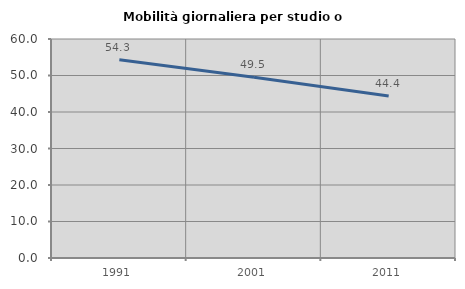
| Category | Mobilità giornaliera per studio o lavoro |
|---|---|
| 1991.0 | 54.313 |
| 2001.0 | 49.538 |
| 2011.0 | 44.364 |